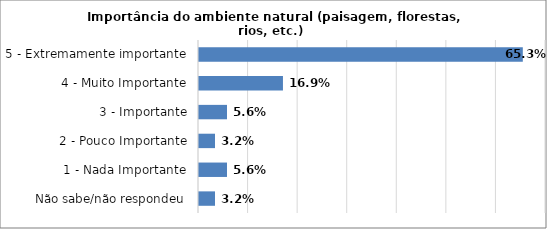
| Category | Series 0 |
|---|---|
| Não sabe/não respondeu | 0.032 |
| 1 - Nada Importante | 0.056 |
| 2 - Pouco Importante | 0.032 |
| 3 - Importante | 0.056 |
| 4 - Muito Importante | 0.169 |
| 5 - Extremamente importante | 0.653 |